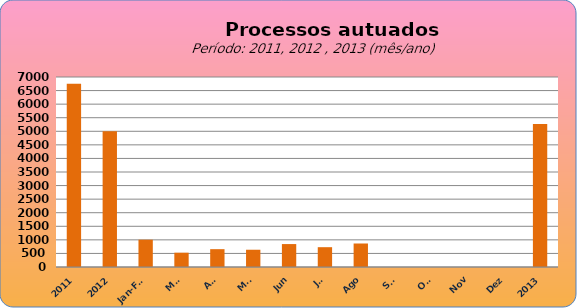
| Category | 6749 4998 1006 527 657 636 845 730 866 0 0 0 0 |
|---|---|
| 2011 | 6749 |
| 2012 | 4998 |
| Jan-Fev | 1006 |
| Mar | 527 |
| Abr | 657 |
| Mai | 636 |
| Jun | 845 |
| Jul | 730 |
| Ago | 866 |
| Set | 0 |
| Out | 0 |
| Nov | 0 |
| Dez | 0 |
| 2013 | 5267 |